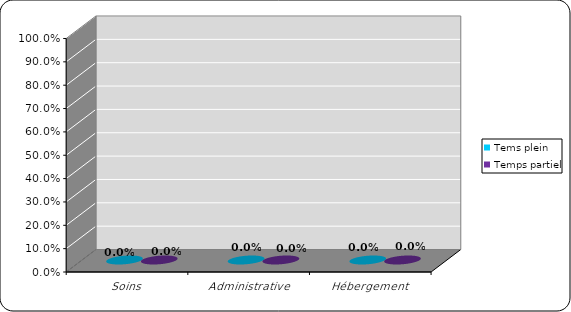
| Category | Tems plein | Temps partiel |
|---|---|---|
| Soins | 0 | 0 |
| Administrative | 0 | 0 |
| Hébergement | 0 | 0 |